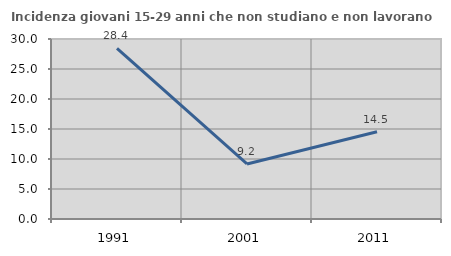
| Category | Incidenza giovani 15-29 anni che non studiano e non lavorano  |
|---|---|
| 1991.0 | 28.44 |
| 2001.0 | 9.173 |
| 2011.0 | 14.548 |